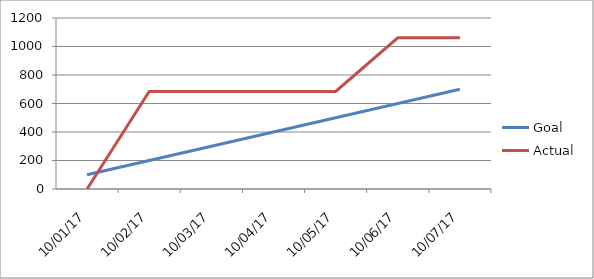
| Category | Goal | Actual |
|---|---|---|
| 2017-10-01 | 100 | 0 |
| 2017-10-02 | 200 | 685 |
| 2017-10-03 | 300 | 685 |
| 2017-10-04 | 400 | 685 |
| 2017-10-05 | 500 | 685 |
| 2017-10-06 | 600 | 1061 |
| 2017-10-07 | 700 | 1061 |